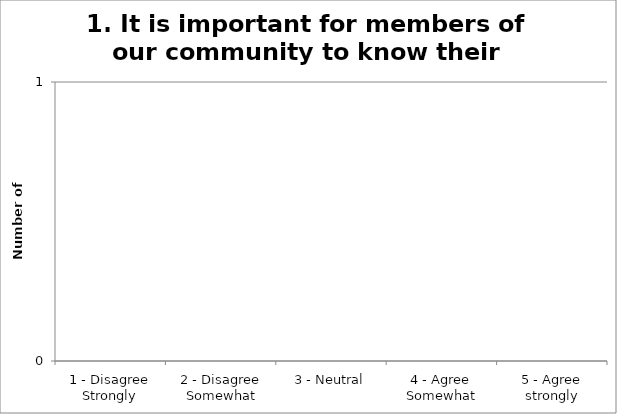
| Category | 1. It is important for members of our community to know their language |
|---|---|
| 1 - Disagree Strongly | 0 |
| 2 - Disagree Somewhat | 0 |
| 3 - Neutral | 0 |
| 4 - Agree Somewhat | 0 |
| 5 - Agree strongly | 0 |